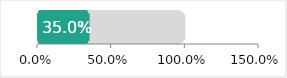
| Category | Total | Male |
|---|---|---|
| 0 | 1 | 0.35 |